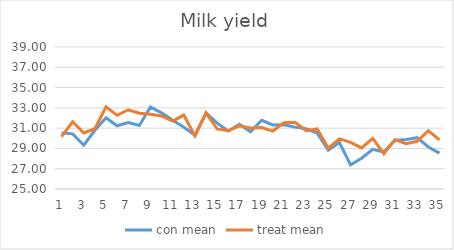
| Category | con mean | treat mean |
|---|---|---|
| 0 | 30.512 | 30.162 |
| 1 | 30.438 | 31.625 |
| 2 | 29.312 | 30.525 |
| 3 | 30.787 | 30.938 |
| 4 | 32.025 | 33.1 |
| 5 | 31.238 | 32.263 |
| 6 | 31.55 | 32.813 |
| 7 | 31.262 | 32.475 |
| 8 | 33.075 | 32.375 |
| 9 | 32.512 | 32.2 |
| 10 | 31.788 | 31.688 |
| 11 | 31.088 | 32.288 |
| 12 | 30.3 | 30.238 |
| 13 | 32.5 | 32.487 |
| 14 | 31.487 | 30.917 |
| 15 | 30.713 | 30.737 |
| 16 | 31.378 | 31.225 |
| 17 | 30.638 | 31.025 |
| 18 | 31.775 | 31.062 |
| 19 | 31.312 | 30.712 |
| 20 | 31.325 | 31.529 |
| 21 | 31.1 | 31.586 |
| 22 | 30.938 | 30.743 |
| 23 | 30.512 | 30.914 |
| 24 | 28.829 | 29.029 |
| 25 | 29.586 | 29.943 |
| 26 | 27.383 | 29.6 |
| 27 | 28.033 | 29.057 |
| 28 | 28.917 | 29.988 |
| 29 | 28.65 | 28.475 |
| 30 | 29.8 | 29.862 |
| 31 | 29.883 | 29.471 |
| 32 | 30.06 | 29.7 |
| 33 | 29.14 | 30.743 |
| 34 | 28.54 | 29.843 |